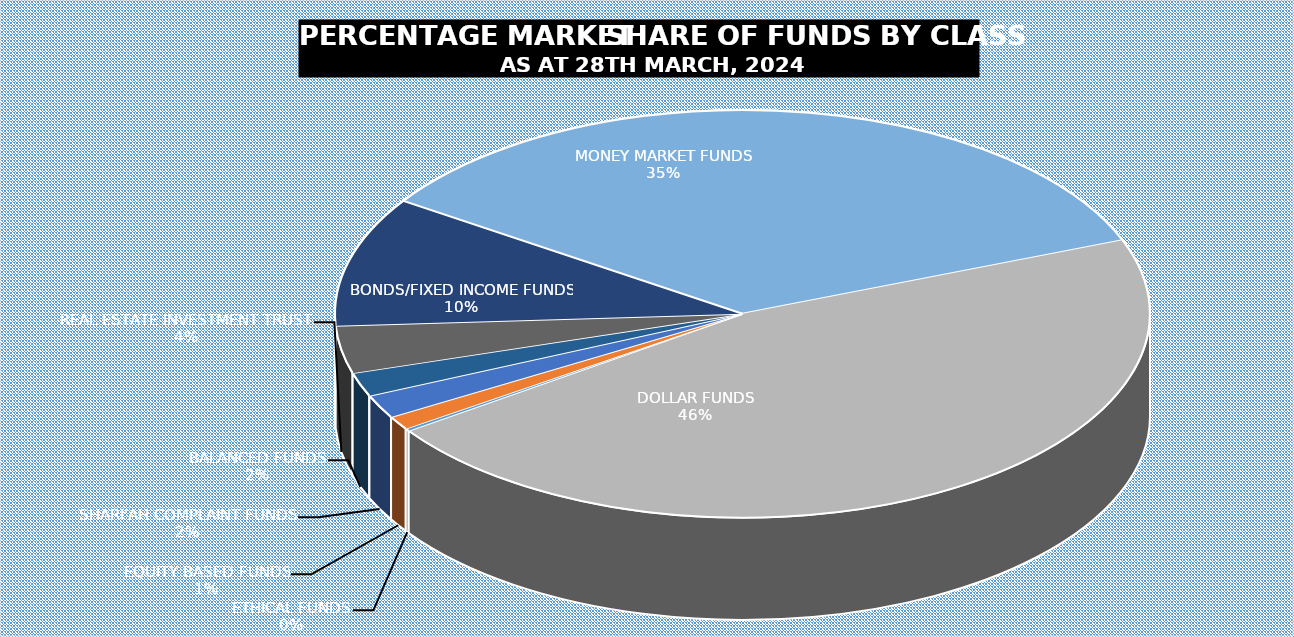
| Category | 28-Mar |
|---|---|
| ETHICAL FUNDS | 5216241473.6 |
| EQUITY BASED FUNDS | 28499552255.214 |
| SHARI'AH COMPLAINT FUNDS | 49193398720.122 |
| BALANCED FUNDS | 49905453494.101 |
| REAL ESTATE INVESTMENT TRUST | 99892436477.227 |
| BONDS/FIXED INCOME FUNDS | 271658696513.585 |
| MONEY MARKET FUNDS | 919496006574.41 |
| DOLLAR FUNDS | 1220986424851.516 |